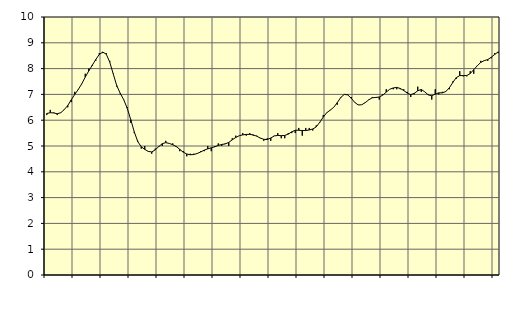
| Category | Piggar | Byggverksamhet, SNI 41-43 |
|---|---|---|
| nan | 6.2 | 6.26 |
| 87.0 | 6.4 | 6.29 |
| 87.0 | 6.3 | 6.28 |
| 87.0 | 6.2 | 6.25 |
| nan | 6.3 | 6.29 |
| 88.0 | 6.4 | 6.41 |
| 88.0 | 6.5 | 6.57 |
| 88.0 | 6.7 | 6.79 |
| nan | 7.1 | 7 |
| 89.0 | 7.2 | 7.19 |
| 89.0 | 7.4 | 7.41 |
| 89.0 | 7.8 | 7.67 |
| nan | 8 | 7.91 |
| 90.0 | 8.1 | 8.13 |
| 90.0 | 8.3 | 8.35 |
| 90.0 | 8.6 | 8.55 |
| nan | 8.6 | 8.64 |
| 91.0 | 8.6 | 8.56 |
| 91.0 | 8.3 | 8.25 |
| 91.0 | 7.8 | 7.79 |
| nan | 7.3 | 7.34 |
| 92.0 | 7 | 7.04 |
| 92.0 | 6.8 | 6.79 |
| 92.0 | 6.5 | 6.46 |
| nan | 5.9 | 6.02 |
| 93.0 | 5.5 | 5.55 |
| 93.0 | 5.2 | 5.17 |
| 93.0 | 4.9 | 4.97 |
| nan | 5 | 4.87 |
| 94.0 | 4.8 | 4.79 |
| 94.0 | 4.7 | 4.77 |
| 94.0 | 4.9 | 4.85 |
| nan | 5 | 4.98 |
| 95.0 | 5 | 5.09 |
| 95.0 | 5.2 | 5.13 |
| 95.0 | 5.1 | 5.1 |
| nan | 5.1 | 5.05 |
| 96.0 | 5 | 4.98 |
| 96.0 | 4.8 | 4.87 |
| 96.0 | 4.8 | 4.76 |
| nan | 4.6 | 4.69 |
| 97.0 | 4.7 | 4.66 |
| 97.0 | 4.7 | 4.67 |
| 97.0 | 4.7 | 4.71 |
| nan | 4.8 | 4.77 |
| 98.0 | 4.8 | 4.84 |
| 98.0 | 5 | 4.89 |
| 98.0 | 4.8 | 4.93 |
| nan | 5 | 4.97 |
| 99.0 | 5.1 | 5.02 |
| 99.0 | 5 | 5.06 |
| 99.0 | 5.1 | 5.08 |
| nan | 5 | 5.14 |
| 0.0 | 5.3 | 5.24 |
| 0.0 | 5.4 | 5.33 |
| 0.0 | 5.4 | 5.4 |
| nan | 5.5 | 5.43 |
| 1.0 | 5.4 | 5.45 |
| 1.0 | 5.5 | 5.45 |
| 1.0 | 5.4 | 5.43 |
| nan | 5.4 | 5.38 |
| 2.0 | 5.3 | 5.31 |
| 2.0 | 5.2 | 5.26 |
| 2.0 | 5.3 | 5.25 |
| nan | 5.2 | 5.31 |
| 3.0 | 5.4 | 5.39 |
| 3.0 | 5.5 | 5.41 |
| 3.0 | 5.3 | 5.4 |
| nan | 5.3 | 5.41 |
| 4.0 | 5.5 | 5.46 |
| 4.0 | 5.5 | 5.55 |
| 4.0 | 5.5 | 5.61 |
| nan | 5.7 | 5.61 |
| 5.0 | 5.4 | 5.6 |
| 5.0 | 5.7 | 5.6 |
| 5.0 | 5.7 | 5.62 |
| nan | 5.6 | 5.66 |
| 6.0 | 5.8 | 5.74 |
| 6.0 | 5.9 | 5.92 |
| 6.0 | 6.2 | 6.12 |
| nan | 6.3 | 6.29 |
| 7.0 | 6.4 | 6.39 |
| 7.0 | 6.5 | 6.5 |
| 7.0 | 6.6 | 6.68 |
| nan | 6.9 | 6.88 |
| 8.0 | 7 | 7 |
| 8.0 | 7 | 6.98 |
| 8.0 | 6.9 | 6.85 |
| nan | 6.7 | 6.69 |
| 9.0 | 6.6 | 6.59 |
| 9.0 | 6.6 | 6.6 |
| 9.0 | 6.7 | 6.68 |
| nan | 6.8 | 6.79 |
| 10.0 | 6.9 | 6.87 |
| 10.0 | 6.9 | 6.88 |
| 10.0 | 6.8 | 6.9 |
| nan | 7 | 6.97 |
| 11.0 | 7.2 | 7.09 |
| 11.0 | 7.2 | 7.2 |
| 11.0 | 7.2 | 7.25 |
| nan | 7.2 | 7.27 |
| 12.0 | 7.2 | 7.23 |
| 12.0 | 7.2 | 7.15 |
| 12.0 | 7.1 | 7.05 |
| nan | 6.9 | 6.99 |
| 13.0 | 7 | 7.04 |
| 13.0 | 7.3 | 7.14 |
| 13.0 | 7.1 | 7.19 |
| nan | 7.1 | 7.1 |
| 14.0 | 7 | 6.98 |
| 14.0 | 6.8 | 6.95 |
| 14.0 | 7.2 | 7.01 |
| nan | 7 | 7.06 |
| 15.0 | 7.1 | 7.06 |
| 15.0 | 7.1 | 7.11 |
| 15.0 | 7.2 | 7.25 |
| nan | 7.5 | 7.46 |
| 16.0 | 7.6 | 7.65 |
| 16.0 | 7.9 | 7.73 |
| 16.0 | 7.7 | 7.73 |
| nan | 7.7 | 7.73 |
| 17.0 | 7.9 | 7.81 |
| 17.0 | 7.8 | 7.96 |
| 17.0 | 8.1 | 8.11 |
| nan | 8.3 | 8.24 |
| 18.0 | 8.3 | 8.31 |
| 18.0 | 8.3 | 8.35 |
| 18.0 | 8.4 | 8.44 |
| nan | 8.6 | 8.55 |
| 19.0 | 8.6 | 8.65 |